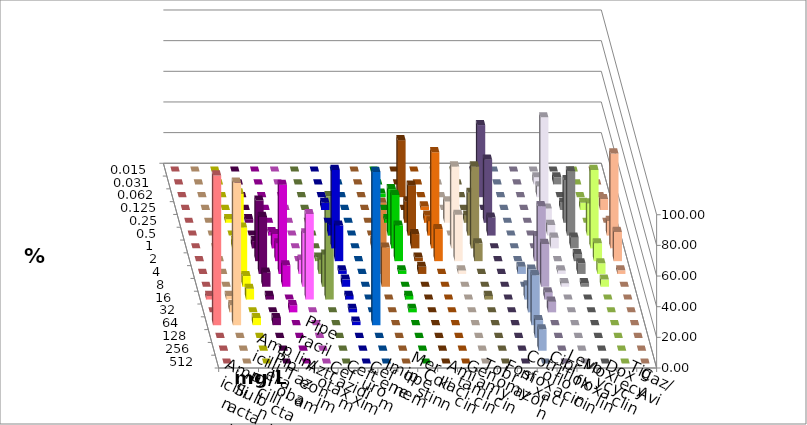
| Category | Ampicillin | Ampicillin/ Sulbactam | Piperacillin | Piperacillin/ Tazobactam | Aztreonam | Cefotaxim | Ceftazidim | Cefuroxim | Imipenem | Meropenem | Colistin | Amikacin | Gentamicin | Tobramycin | Fosfomycin | Cotrimoxazol | Ciprofloxacin | Levofloxacin | Moxifloxacin | Doxycyclin | Tigecyclin | Caz/Avi |
|---|---|---|---|---|---|---|---|---|---|---|---|---|---|---|---|---|---|---|---|---|---|---|
| 0.015 | 0 | 0 | 0 | 0 | 0 | 0 | 0 | 0 | 0 | 0 | 0 | 0 | 0 | 0 | 0 | 0 | 0 | 0 | 0 | 0 | 0 | 0 |
| 0.031 | 0 | 0 | 0 | 0 | 0 | 0 | 0 | 0 | 0 | 0 | 0 | 0 | 0 | 0 | 0 | 0 | 4.651 | 4.651 | 0 | 0 | 0 | 0 |
| 0.062 | 0 | 0 | 0 | 0 | 0 | 0 | 0 | 0 | 2.326 | 37.209 | 0 | 0 | 0 | 47.059 | 0 | 0 | 6.977 | 0 | 0 | 0 | 0 | 0 |
| 0.125 | 0 | 0 | 0 | 0 | 0 | 0 | 4.651 | 0 | 0 | 0 | 2.326 | 0 | 0 | 0 | 0 | 0 | 60.465 | 4.651 | 4.651 | 0 | 0 | 7.143 |
| 0.25 | 0 | 0 | 2.326 | 2.326 | 0 | 0 | 0 | 0 | 2.326 | 13.953 | 4.651 | 13.953 | 4.651 | 41.176 | 0 | 0 | 9.302 | 27.907 | 0 | 0 | 0 | 0 |
| 0.5 | 0 | 0 | 0 | 0 | 2.326 | 0 | 6.977 | 0 | 30.233 | 32.558 | 9.302 | 0 | 27.907 | 11.765 | 0 | 0 | 6.977 | 41.86 | 20.93 | 0 | 0 | 9.524 |
| 1.0 | 0 | 0 | 4.651 | 4.651 | 9.302 | 0 | 51.163 | 0 | 34.884 | 9.302 | 62.791 | 53.488 | 53.488 | 0 | 0 | 0 | 6.977 | 6.977 | 51.163 | 0 | 4.651 | 61.905 |
| 2.0 | 0 | 0 | 44.186 | 39.535 | 11.628 | 0 | 23.256 | 0 | 23.256 | 2.326 | 20.93 | 30.233 | 11.628 | 0 | 0 | 16.279 | 0 | 4.651 | 11.628 | 2.326 | 23.256 | 19.048 |
| 4.0 | 0 | 0 | 30.233 | 37.209 | 58.14 | 9.302 | 2.326 | 0 | 2.326 | 4.651 | 0 | 2.326 | 0 | 0 | 4.651 | 44.186 | 2.326 | 6.977 | 6.977 | 9.302 | 46.512 | 2.381 |
| 8.0 | 0 | 0 | 6.977 | 9.302 | 13.953 | 34.884 | 4.651 | 0 | 0 | 0 | 0 | 0 | 0 | 0 | 0 | 27.907 | 2.326 | 2.326 | 4.651 | 20.93 | 25.581 | 0 |
| 16.0 | 2.326 | 2.326 | 6.977 | 2.326 | 0 | 55.814 | 2.326 | 0 | 2.326 | 0 | 0 | 0 | 2.326 | 0 | 9.302 | 4.651 | 0 | 0 | 0 | 67.442 | 0 | 0 |
| 32.0 | 0 | 4.651 | 0 | 0 | 4.651 | 0 | 2.326 | 0 | 2.326 | 0 | 0 | 0 | 0 | 0 | 27.907 | 6.977 | 0 | 0 | 0 | 0 | 0 | 0 |
| 64.0 | 97.674 | 93.023 | 4.651 | 4.651 | 0 | 0 | 2.326 | 100 | 0 | 0 | 0 | 0 | 0 | 0 | 32.558 | 0 | 0 | 0 | 0 | 0 | 0 | 0 |
| 128.0 | 0 | 0 | 0 | 0 | 0 | 0 | 0 | 0 | 0 | 0 | 0 | 0 | 0 | 0 | 11.628 | 0 | 0 | 0 | 0 | 0 | 0 | 0 |
| 256.0 | 0 | 0 | 0 | 0 | 0 | 0 | 0 | 0 | 0 | 0 | 0 | 0 | 0 | 0 | 13.953 | 0 | 0 | 0 | 0 | 0 | 0 | 0 |
| 512.0 | 0 | 0 | 0 | 0 | 0 | 0 | 0 | 0 | 0 | 0 | 0 | 0 | 0 | 0 | 0 | 0 | 0 | 0 | 0 | 0 | 0 | 0 |